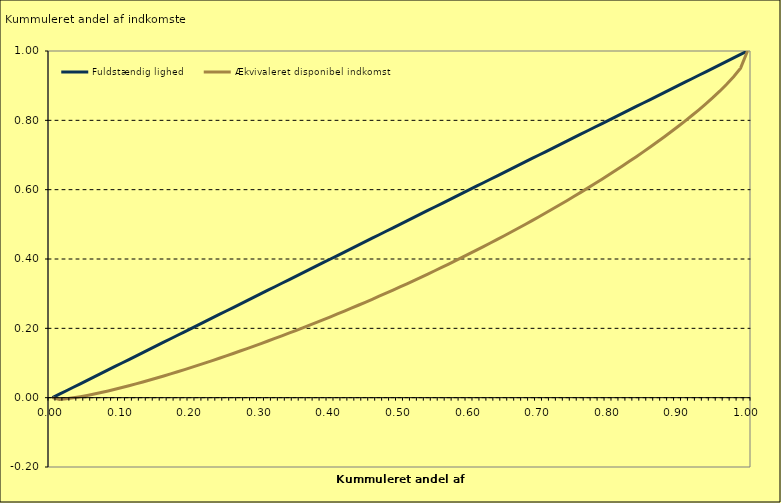
| Category | Fuldstændig lighed | Ækvivaleret disponibel indkomst |
|---|---|---|
| 0.0 | 0 | 0 |
| 0.01 | 0.01 | -0.005 |
| 0.02 | 0.02 | -0.003 |
| 0.03 | 0.03 | -0.001 |
| 0.04 | 0.04 | 0.003 |
| 0.05 | 0.05 | 0.006 |
| 0.06 | 0.06 | 0.01 |
| 0.07 | 0.07 | 0.015 |
| 0.08 | 0.08 | 0.019 |
| 0.09 | 0.09 | 0.024 |
| 0.1 | 0.1 | 0.029 |
| 0.11 | 0.11 | 0.034 |
| 0.12 | 0.12 | 0.04 |
| 0.13 | 0.13 | 0.045 |
| 0.14 | 0.14 | 0.051 |
| 0.15 | 0.15 | 0.057 |
| 0.16 | 0.16 | 0.063 |
| 0.17 | 0.17 | 0.069 |
| 0.18 | 0.18 | 0.075 |
| 0.19 | 0.19 | 0.081 |
| 0.2 | 0.2 | 0.087 |
| 0.21 | 0.21 | 0.094 |
| 0.22 | 0.22 | 0.1 |
| 0.23 | 0.23 | 0.107 |
| 0.24 | 0.24 | 0.114 |
| 0.25 | 0.25 | 0.121 |
| 0.26 | 0.26 | 0.128 |
| 0.27 | 0.27 | 0.135 |
| 0.28 | 0.28 | 0.142 |
| 0.29 | 0.29 | 0.149 |
| 0.3 | 0.3 | 0.156 |
| 0.31 | 0.31 | 0.163 |
| 0.32 | 0.32 | 0.171 |
| 0.33 | 0.33 | 0.178 |
| 0.34 | 0.34 | 0.186 |
| 0.35 | 0.35 | 0.194 |
| 0.36 | 0.36 | 0.201 |
| 0.37 | 0.37 | 0.209 |
| 0.38 | 0.38 | 0.217 |
| 0.39 | 0.39 | 0.225 |
| 0.4 | 0.4 | 0.233 |
| 0.41 | 0.41 | 0.241 |
| 0.42 | 0.42 | 0.25 |
| 0.43 | 0.43 | 0.258 |
| 0.44 | 0.44 | 0.267 |
| 0.45 | 0.45 | 0.275 |
| 0.46 | 0.46 | 0.284 |
| 0.47 | 0.47 | 0.293 |
| 0.48 | 0.48 | 0.301 |
| 0.49 | 0.49 | 0.31 |
| 0.5 | 0.5 | 0.319 |
| 0.51 | 0.51 | 0.329 |
| 0.52 | 0.52 | 0.338 |
| 0.53 | 0.53 | 0.347 |
| 0.54 | 0.54 | 0.357 |
| 0.55 | 0.55 | 0.366 |
| 0.56 | 0.56 | 0.376 |
| 0.57 | 0.57 | 0.385 |
| 0.58 | 0.58 | 0.395 |
| 0.59 | 0.59 | 0.405 |
| 0.6 | 0.6 | 0.415 |
| 0.61 | 0.61 | 0.425 |
| 0.62 | 0.62 | 0.436 |
| 0.63 | 0.63 | 0.446 |
| 0.64 | 0.64 | 0.457 |
| 0.65 | 0.65 | 0.467 |
| 0.66 | 0.66 | 0.478 |
| 0.67 | 0.67 | 0.489 |
| 0.68 | 0.68 | 0.5 |
| 0.69 | 0.69 | 0.511 |
| 0.7 | 0.7 | 0.522 |
| 0.71 | 0.71 | 0.533 |
| 0.72 | 0.72 | 0.545 |
| 0.73 | 0.73 | 0.556 |
| 0.74 | 0.74 | 0.568 |
| 0.75 | 0.75 | 0.58 |
| 0.76 | 0.76 | 0.592 |
| 0.77 | 0.77 | 0.604 |
| 0.78 | 0.78 | 0.617 |
| 0.79 | 0.79 | 0.629 |
| 0.8 | 0.8 | 0.642 |
| 0.81 | 0.81 | 0.655 |
| 0.82 | 0.82 | 0.668 |
| 0.83 | 0.83 | 0.682 |
| 0.84 | 0.84 | 0.695 |
| 0.85 | 0.85 | 0.709 |
| 0.86 | 0.86 | 0.723 |
| 0.87 | 0.87 | 0.737 |
| 0.88 | 0.88 | 0.752 |
| 0.89 | 0.89 | 0.767 |
| 0.9 | 0.9 | 0.782 |
| 0.91 | 0.91 | 0.798 |
| 0.92 | 0.92 | 0.814 |
| 0.93 | 0.93 | 0.83 |
| 0.94 | 0.94 | 0.848 |
| 0.95 | 0.95 | 0.865 |
| 0.96 | 0.96 | 0.884 |
| 0.97 | 0.97 | 0.904 |
| 0.98 | 0.98 | 0.926 |
| 0.99 | 0.99 | 0.95 |
| 1.0 | 1 | 1 |